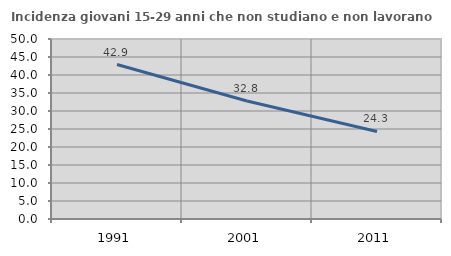
| Category | Incidenza giovani 15-29 anni che non studiano e non lavorano  |
|---|---|
| 1991.0 | 42.903 |
| 2001.0 | 32.792 |
| 2011.0 | 24.324 |